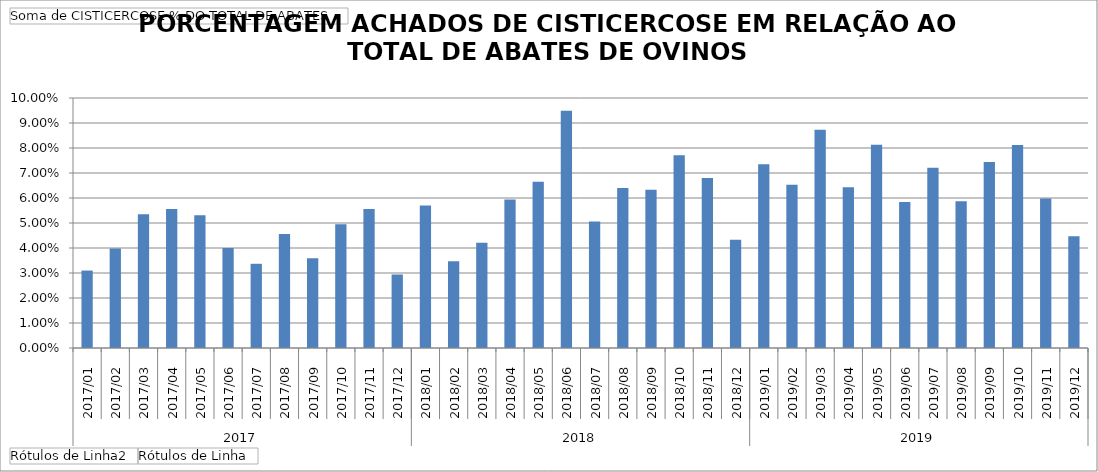
| Category | Total |
|---|---|
| 0 | 0.031 |
| 1 | 0.04 |
| 2 | 0.053 |
| 3 | 0.056 |
| 4 | 0.053 |
| 5 | 0.04 |
| 6 | 0.034 |
| 7 | 0.046 |
| 8 | 0.036 |
| 9 | 0.05 |
| 10 | 0.056 |
| 11 | 0.029 |
| 12 | 0.057 |
| 13 | 0.035 |
| 14 | 0.042 |
| 15 | 0.059 |
| 16 | 0.067 |
| 17 | 0.095 |
| 18 | 0.051 |
| 19 | 0.064 |
| 20 | 0.063 |
| 21 | 0.077 |
| 22 | 0.068 |
| 23 | 0.043 |
| 24 | 0.074 |
| 25 | 0.065 |
| 26 | 0.087 |
| 27 | 0.064 |
| 28 | 0.081 |
| 29 | 0.058 |
| 30 | 0.072 |
| 31 | 0.059 |
| 32 | 0.074 |
| 33 | 0.081 |
| 34 | 0.06 |
| 35 | 0.045 |